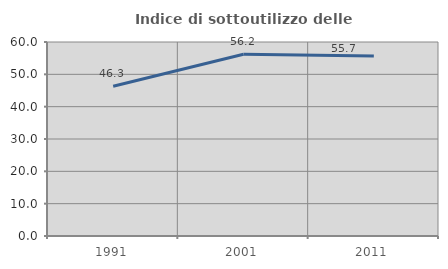
| Category | Indice di sottoutilizzo delle abitazioni  |
|---|---|
| 1991.0 | 46.318 |
| 2001.0 | 56.202 |
| 2011.0 | 55.7 |